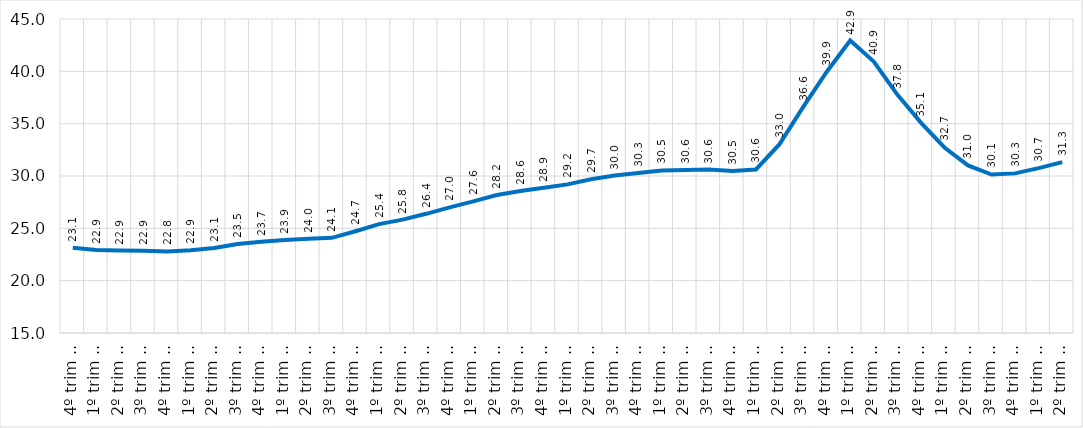
| Category | Series 0 |
|---|---|
| 4º trim / 2012 | 23.15 |
| 1º trim / 2013 | 22.924 |
| 2º trim / 2013 | 22.873 |
| 3º trim / 2013 | 22.856 |
| 4º trim / 2013 | 22.789 |
| 1º trim / 2014 | 22.907 |
| 2º trim / 2014 | 23.129 |
| 3º trim / 2014 | 23.505 |
| 4º trim / 2014 | 23.719 |
| 1º trim / 2015 | 23.878 |
| 2º trim / 2015 | 24.008 |
| 3º trim / 2015 | 24.095 |
| 4º trim / 2015 | 24.725 |
| 1º trim / 2016 | 25.407 |
| 2º trim / 2016 | 25.829 |
| 3º trim / 2016 | 26.387 |
| 4º trim / 2016 | 27.008 |
| 1º trim / 2017 | 27.573 |
| 2º trim / 2017 | 28.184 |
| 3º trim / 2017 | 28.56 |
| 4º trim / 2017 | 28.88 |
| 1º trim / 2018 | 29.198 |
| 2º trim / 2018 | 29.691 |
| 3º trim / 2018 | 30.038 |
| 4º trim / 2018 | 30.292 |
| 1º trim / 2019 | 30.529 |
| 2º trim / 2019 | 30.57 |
| 3º trim / 2019 | 30.62 |
| 4º trim / 2019 | 30.473 |
| 1º trim / 2020 | 30.624 |
| 2º trim / 2020 | 33.042 |
| 3º trim / 2020 | 36.576 |
| 4º trim / 2020 | 39.937 |
| 1º trim / 2021 | 42.944 |
| 2º trim / 2021 | 40.941 |
| 3º trim / 2021 | 37.78 |
| 4º trim / 2021 | 35.101 |
| 1º trim / 2022 | 32.725 |
| 2º trim / 2022 | 31.01 |
| 3º trim / 2022 | 30.143 |
| 4º trim / 2022 | 30.25 |
| 1º trim / 2023 | 30.75 |
| 2º trim / 2023 | 31.324 |